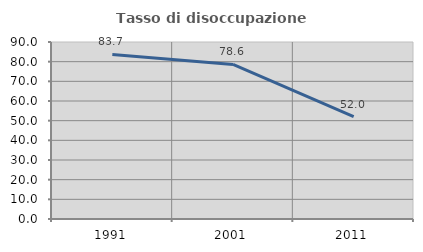
| Category | Tasso di disoccupazione giovanile  |
|---|---|
| 1991.0 | 83.654 |
| 2001.0 | 78.571 |
| 2011.0 | 52 |